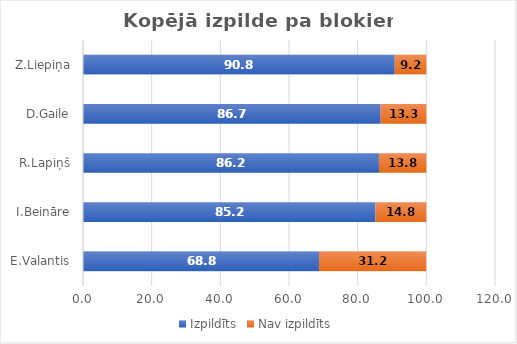
| Category | Izpildīts | Nav izpildīts |
|---|---|---|
| E.Valantis | 68.75 | 31.2 |
| I.Beināre | 85.2 | 14.8 |
| R.Lapiņš | 86.2 | 13.8 |
| D.Gaile | 86.7 | 13.3 |
| Z.Liepiņa | 90.8 | 9.2 |